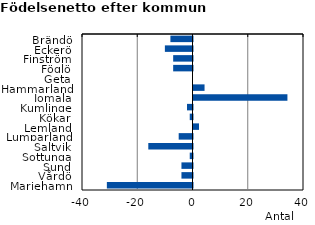
| Category | Series 0 |
|---|---|
| Brändö | -8 |
| Eckerö | -10 |
| Finström | -7 |
| Föglö | -7 |
| Geta | 0 |
| Hammarland | 4 |
| Jomala | 34 |
| Kumlinge | -2 |
| Kökar | -1 |
| Lemland | 2 |
| Lumparland | -5 |
| Saltvik | -16 |
| Sottunga | -1 |
| Sund | -4 |
| Vårdö | -4 |
| Mariehamn | -31 |